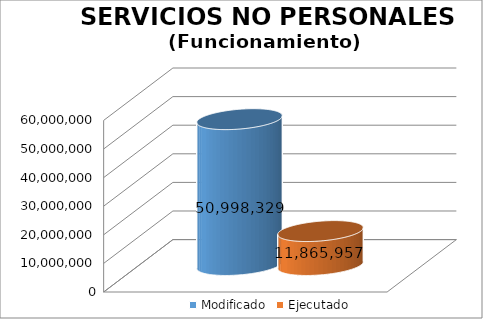
| Category | Modificado | Ejecutado |
|---|---|---|
| 0 | 50998329 | 11865956.86 |